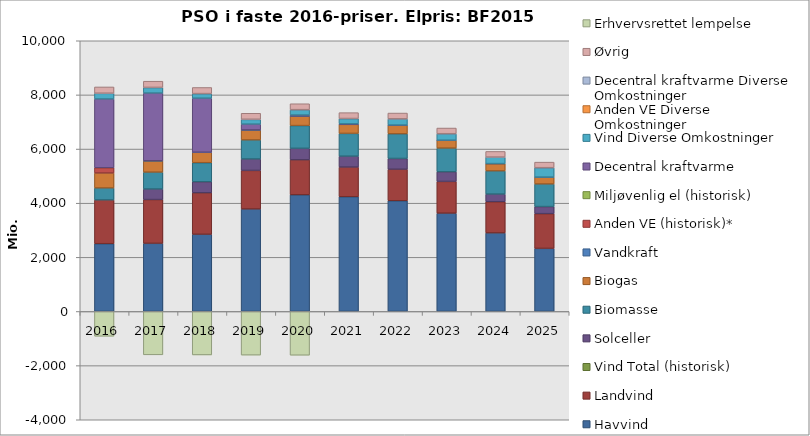
| Category | Havvind | Landvind | Vind Total (historisk) | Solceller | Biomasse | Biogas | Vandkraft | Anden VE (historisk)* | Miljøvenlig el (historisk) | Decentral kraftvarme | Vind Diverse Omkostninger | Anden VE Diverse Omkostninger | Decentral kraftvarme Diverse Omkostninger | Øvrig | Erhvervsrettet lempelse |
|---|---|---|---|---|---|---|---|---|---|---|---|---|---|---|---|
| 2016 | 2503.6 | 1615.534 | 0 | 0 | 442.278 | 552.308 | 0 | 195.5 | 0 | 2539.565 | 208.025 | 0 | 6.18 | 231.18 | -915.921 |
| 2017 | 2516.913 | 1617.112 | 0 | 388.036 | 623.953 | 417.793 | 3.251 | 0 | 0 | 2500.336 | 202.329 | 0 | 6.913 | 229.085 | -1602.039 |
| 2018 | 2851.417 | 1531.451 | 0 | 406.728 | 705.796 | 384.787 | 2.984 | 0 | 0 | 1994.595 | 163.867 | 0 | 6.775 | 225.301 | -1604.96 |
| 2019 | 3784.986 | 1424.617 | 0 | 422.283 | 704 | 367.798 | 2.801 | 0 | 0 | 213.415 | 172.929 | 0 | 6.659 | 222.225 | -1612.378 |
| 2020 | 4309.212 | 1291.558 | 0 | 425.336 | 840.596 | 351.932 | 2.604 | 0 | 0 | 33.95 | 192.39 | 0 | 6.533 | 218.792 | -1616.669 |
| 2021 | 4238.548 | 1094.997 | 0 | 402.379 | 841.642 | 334.648 | 2.317 | 0 | 0 | 15.205 | 192.161 | 0 | 6.427 | 216.038 | 0 |
| 2022 | 4089.167 | 1164.626 | 0 | 398.068 | 909.161 | 316.672 | 2.139 | 0 | 0 | 5.468 | 224.701 | 0 | 6.323 | 213.301 | 0 |
| 2023 | 3631.009 | 1173.008 | 0 | 353.968 | 876.66 | 288.983 | 2.022 | 0 | 0 | 0.774 | 233.203 | 0 | 6.22 | 210.587 | 0 |
| 2024 | 2900.864 | 1153.409 | 0 | 281.062 | 856.426 | 268.834 | 1.911 | 0 | 0 | 0 | 234.76 | 0 | 6.12 | 207.963 | 0 |
| 2025 | 2330.339 | 1283.098 | 0 | 260.996 | 834.088 | 253.691 | 1.86 | 0 | 0 | 0 | 341.258 | 0 | 6.022 | 205.398 | 0 |